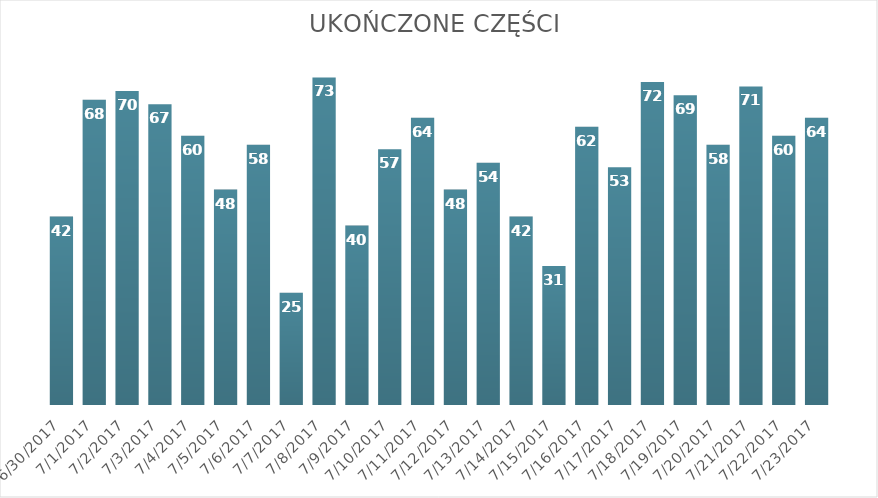
| Category | Ukończone części |
|---|---|
| 6/30/17 | 42 |
| 7/1/17 | 68 |
| 7/2/17 | 70 |
| 7/3/17 | 67 |
| 7/4/17 | 60 |
| 7/5/17 | 48 |
| 7/6/17 | 58 |
| 7/7/17 | 25 |
| 7/8/17 | 73 |
| 7/9/17 | 40 |
| 7/10/17 | 57 |
| 7/11/17 | 64 |
| 7/12/17 | 48 |
| 7/13/17 | 54 |
| 7/14/17 | 42 |
| 7/15/17 | 31 |
| 7/16/17 | 62 |
| 7/17/17 | 53 |
| 7/18/17 | 72 |
| 7/19/17 | 69 |
| 7/20/17 | 58 |
| 7/21/17 | 71 |
| 7/22/17 | 60 |
| 7/23/17 | 64 |